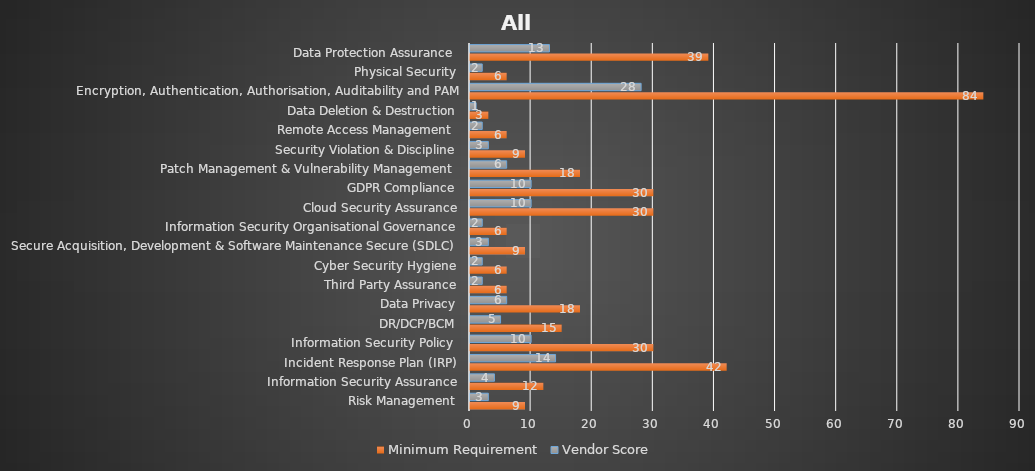
| Category | Minimum Requirement | Vendor Score |
|---|---|---|
| Risk Management | 9 | 3 |
| Information Security Assurance | 12 | 4 |
| Incident Response Plan (IRP) | 42 | 14 |
| Information Security Policy  | 30 | 10 |
| DR/DCP/BCM | 15 | 5 |
| Data Privacy | 18 | 6 |
| Third Party Assurance | 6 | 2 |
| Cyber Security Hygiene | 6 | 2 |
| Secure Acquisition, Development & Software Maintenance Secure (SDLC)  | 9 | 3 |
| Information Security Organisational Governance | 6 | 2 |
| Cloud Security Assurance | 30 | 10 |
| GDPR Compliance | 30 | 10 |
| Patch Management & Vulnerability Management  | 18 | 6 |
| Security Violation & Discipline | 9 | 3 |
| Remote Access Management  | 6 | 2 |
| Data Deletion & Destruction | 3 | 1 |
| Encryption, Authentication, Authorisation, Auditability and PAM | 84 | 28 |
| Physical Security | 6 | 2 |
| Data Protection Assurance  | 39 | 13 |